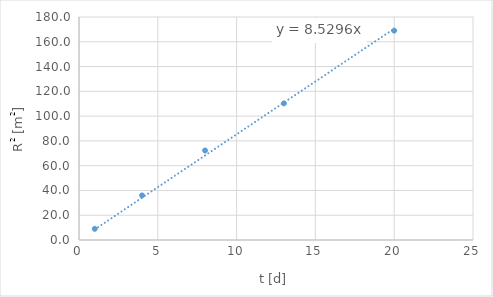
| Category | Series 0 |
|---|---|
| 1.0 | 9 |
| 4.0 | 36 |
| 8.0 | 72.25 |
| 13.0 | 110.25 |
| 20.0 | 169 |